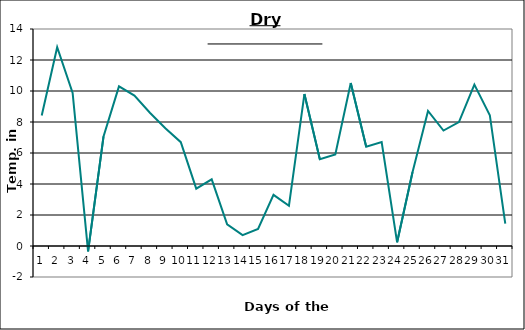
| Category | Series 0 |
|---|---|
| 0 | 8.42 |
| 1 | 12.82 |
| 2 | 9.88 |
| 3 | -0.35 |
| 4 | 7.07 |
| 5 | 10.3 |
| 6 | 9.7 |
| 7 | 8.6 |
| 8 | 7.6 |
| 9 | 6.7 |
| 10 | 3.7 |
| 11 | 4.3 |
| 12 | 1.4 |
| 13 | 0.7 |
| 14 | 1.1 |
| 15 | 3.3 |
| 16 | 2.6 |
| 17 | 9.8 |
| 18 | 5.6 |
| 19 | 5.9 |
| 20 | 10.52 |
| 21 | 6.41 |
| 22 | 6.7 |
| 23 | 0.24 |
| 24 | 4.77 |
| 25 | 8.71 |
| 26 | 7.45 |
| 27 | 7.99 |
| 28 | 10.41 |
| 29 | 8.44 |
| 30 | 1.44 |